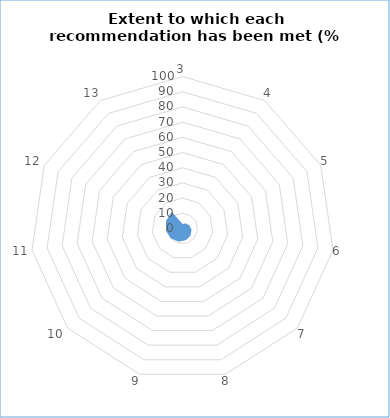
| Category | Series 0 | Series 1 |
|---|---|---|
| 3.0 | 3 | 0 |
| 4.0 | 4 | 0 |
| 5.0 | 5 | 0 |
| 6.0 | 6 | 0 |
| 7.0 | 7 | 0 |
| 8.0 | 8 | 0 |
| 9.0 | 9 | 0 |
| 10.0 | 10 | 0 |
| 11.0 | 11 | 0 |
| 12.0 | 12 | 0 |
| 13.0 | 13 | 0 |